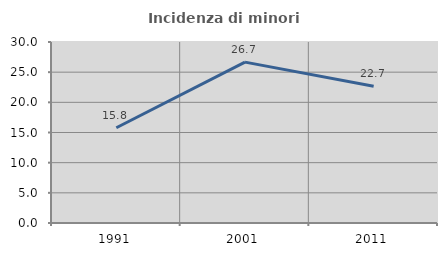
| Category | Incidenza di minori stranieri |
|---|---|
| 1991.0 | 15.789 |
| 2001.0 | 26.667 |
| 2011.0 | 22.673 |